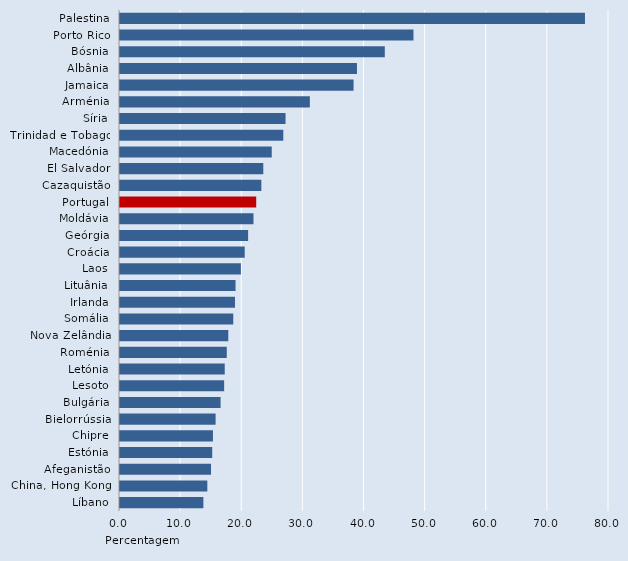
| Category | Series 0 |
|---|---|
| Palestina | 76.067 |
| Porto Rico | 48.012 |
| Bósnia | 43.323 |
| Albânia | 38.765 |
| Jamaica | 38.214 |
| Arménia | 31.06 |
| Síria | 27.086 |
| Trinidad e Tobago | 26.714 |
| Macedónia | 24.827 |
| El Salvador | 23.441 |
| Cazaquistão | 23.124 |
| Portugal | 22.284 |
| Moldávia | 21.839 |
| Geórgia | 20.962 |
| Croácia | 20.403 |
| Laos | 19.775 |
| Lituânia | 18.904 |
| Irlanda | 18.813 |
| Somália | 18.529 |
| Nova Zelândia | 17.717 |
| Roménia | 17.467 |
| Letónia | 17.137 |
| Lesoto | 17.038 |
| Bulgária | 16.453 |
| Bielorrússia | 15.642 |
| Chipre | 15.205 |
| Estónia | 15.088 |
| Afeganistão | 14.89 |
| China, Hong Kong | 14.287 |
| Líbano | 13.642 |